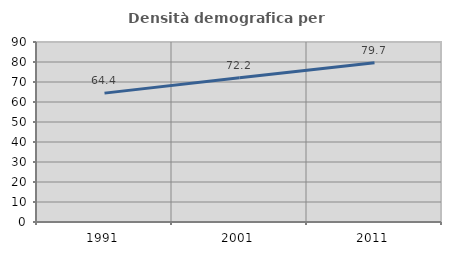
| Category | Densità demografica |
|---|---|
| 1991.0 | 64.437 |
| 2001.0 | 72.174 |
| 2011.0 | 79.671 |